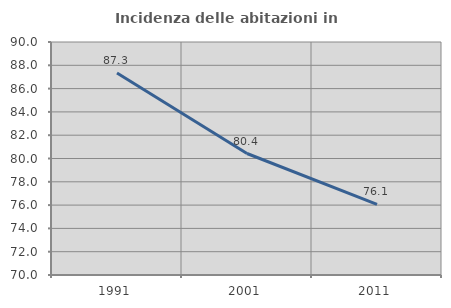
| Category | Incidenza delle abitazioni in proprietà  |
|---|---|
| 1991.0 | 87.337 |
| 2001.0 | 80.428 |
| 2011.0 | 76.058 |